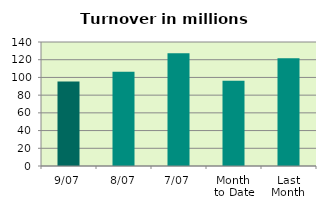
| Category | Series 0 |
|---|---|
| 9/07 | 95.343 |
| 8/07 | 106.276 |
| 7/07 | 127.39 |
| Month 
to Date | 96.384 |
| Last
Month | 121.74 |